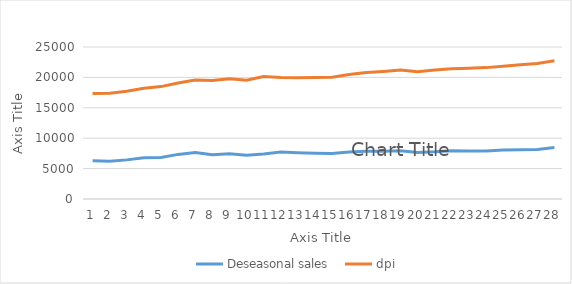
| Category | Deseasonal sales  | dpi |
|---|---|---|
| 0 | 6304.7 | 11041 |
| 1 | 6201.2 | 11198 |
| 2 | 6434.3 | 11287 |
| 3 | 6797.8 | 11426 |
| 4 | 6834 | 11652 |
| 5 | 7337.2 | 11752 |
| 6 | 7653.4 | 11925 |
| 7 | 7296.1 | 12190 |
| 8 | 7437.2 | 12321 |
| 9 | 7189.6 | 12355 |
| 10 | 7392.6 | 12748 |
| 11 | 7714.8 | 12259 |
| 12 | 7609.8 | 12336 |
| 13 | 7544.2 | 12454 |
| 14 | 7481 | 12534 |
| 15 | 7740.1 | 12736 |
| 16 | 7841 | 12962 |
| 17 | 7853.2 | 13127 |
| 18 | 7932.9 | 13265 |
| 19 | 7667.7 | 13277 |
| 20 | 7765.9 | 13465 |
| 21 | 7938.1 | 13465 |
| 22 | 7909.9 | 13612 |
| 23 | 7882.1 | 13726 |
| 24 | 8040.5 | 13807 |
| 25 | 8119.6 | 13977 |
| 26 | 8159.4 | 14129 |
| 27 | 8463 | 14270 |